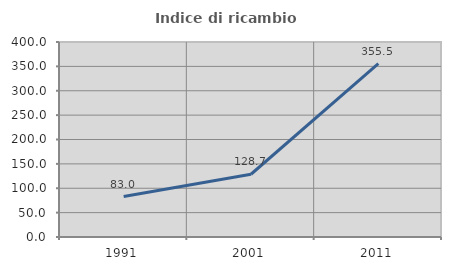
| Category | Indice di ricambio occupazionale  |
|---|---|
| 1991.0 | 83.047 |
| 2001.0 | 128.713 |
| 2011.0 | 355.484 |